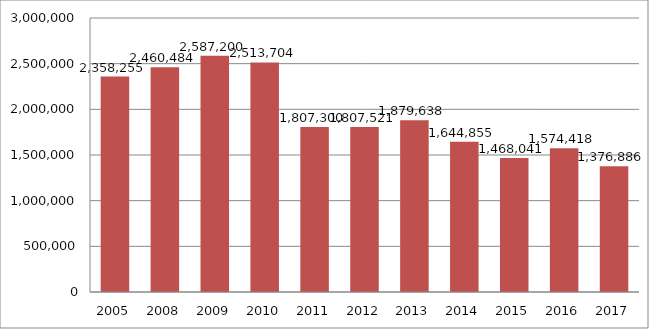
| Category | Samlet emission |
|---|---|
| 2005.0 | 2358255 |
| 2008.0 | 2460484 |
| 2009.0 | 2587200 |
| 2010.0 | 2513704 |
| 2011.0 | 1807299.759 |
| 2012.0 | 1807520.526 |
| 2013.0 | 1879637.813 |
| 2014.0 | 1644855.311 |
| 2015.0 | 1468040.921 |
| 2016.0 | 1574418.175 |
| 2017.0 | 1376886.333 |